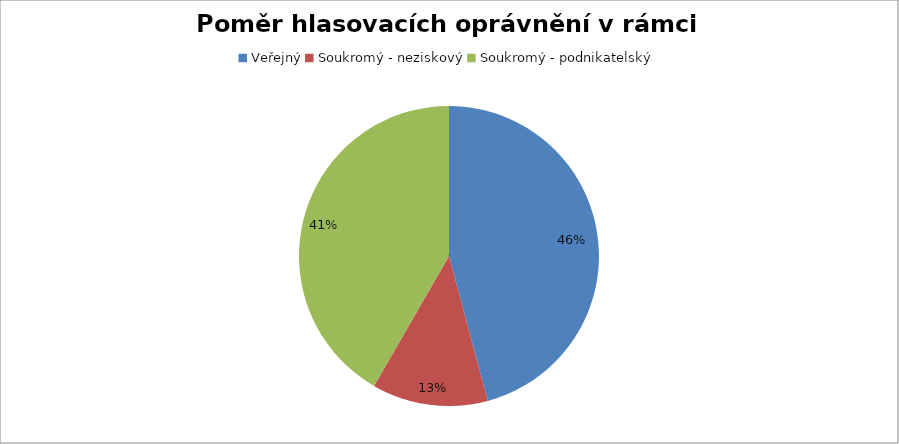
| Category | Series 0 |
|---|---|
| Veřejný | 0.458 |
| Soukromý - neziskový | 0.125 |
| Soukromý - podnikatelský | 0.417 |